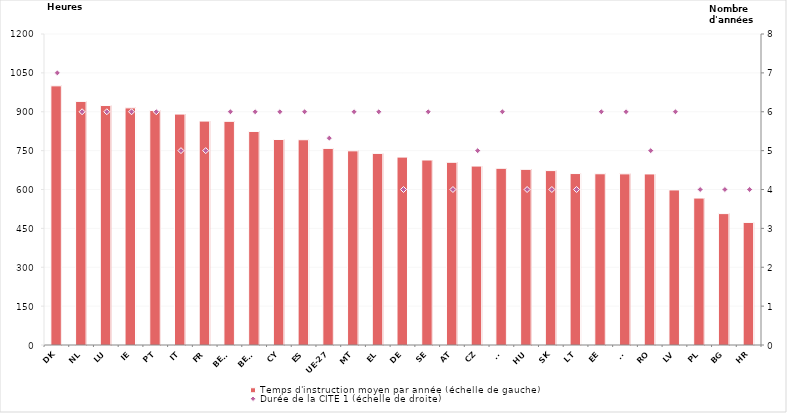
| Category | Temps d'instruction moyen par année (échelle de gauche) |
|---|---|
| DK | 1000 |
| NL | 940 |
| LU | 924 |
| IE | 915 |
| PT | 905 |
| IT | 891 |
| FR | 864 |
| BEfr | 863 |
| BEnl | 824 |
| CY | 793 |
| ES | 792 |
| UE-27 | 758.664 |
| MT | 749.167 |
| EL | 739.333 |
| DE | 725 |
| SE | 713.833 |
| AT | 705 |
| CZ | 690.4 |
| SI | 681.833 |
| HU | 677.75 |
| SK | 673 |
| LT | 661.5 |
| EE | 660.667 |
| FI | 660.333 |
| RO | 660 |
| LV | 598.333 |
| PL | 567 |
| BG | 507 |
| HR | 473 |